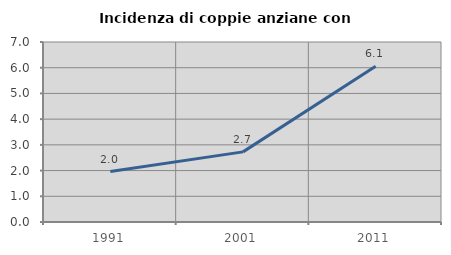
| Category | Incidenza di coppie anziane con figli |
|---|---|
| 1991.0 | 1.961 |
| 2001.0 | 2.727 |
| 2011.0 | 6.061 |